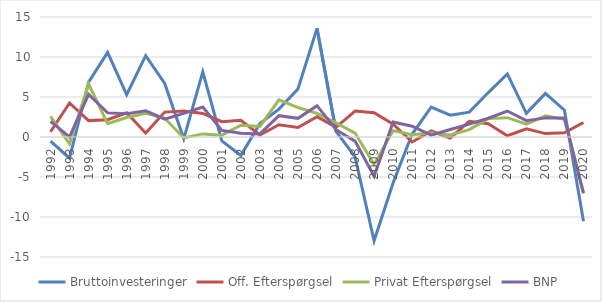
| Category | Bruttoinvesteringer | Off. Efterspørgsel | Privat Efterspørgsel | BNP |
|---|---|---|---|---|
| 1992 | -0.513 | 0.655 | 2.565 | 1.957 |
| 1993 | -2.643 | 4.259 | -0.861 | 0.011 |
| 1994 | 6.86 | 2.05 | 6.658 | 5.332 |
| 1995 | 10.566 | 2.155 | 1.679 | 3.028 |
| 1996 | 5.291 | 3.029 | 2.43 | 2.898 |
| 1997 | 10.165 | 0.508 | 2.962 | 3.267 |
| 1998 | 6.685 | 3.111 | 2.345 | 2.22 |
| 1999 | -0.228 | 3.249 | -0.12 | 2.948 |
| 2000 | 8.145 | 2.947 | 0.387 | 3.742 |
| 2001 | -0.484 | 1.917 | 0.226 | 0.823 |
| 2002 | -2.31 | 2.095 | 1.472 | 0.467 |
| 2003 | 1.68 | 0.256 | 1.32 | 0.388 |
| 2004 | 3.488 | 1.535 | 4.642 | 2.668 |
| 2005 | 6.002 | 1.191 | 3.685 | 2.336 |
| 2006 | 13.584 | 2.535 | 2.959 | 3.918 |
| 2007 | 0.712 | 1.214 | 1.766 | 0.913 |
| 2008 | -2.487 | 3.25 | 0.488 | -0.516 |
| 2009 | -12.978 | 3.042 | -3.443 | -4.905 |
| 2010 | -5.718 | 1.599 | 0.795 | 1.868 |
| 2011 | 0.366 | -0.626 | 0.278 | 1.342 |
| 2012 | 3.735 | 0.751 | 0.509 | 0.223 |
| 2013 | 2.722 | -0.121 | 0.265 | 0.935 |
| 2014 | 3.106 | 1.957 | 0.918 | 1.611 |
| 2015 | 5.556 | 1.662 | 2.297 | 2.348 |
| 2016 | 7.882 | 0.156 | 2.412 | 3.248 |
| 2017 | 2.961 | 1.011 | 1.617 | 2.037 |
| 2018 | 5.446 | 0.423 | 2.639 | 2.389 |
| 2019 | 3.353 | 0.537 | 2.206 | 2.367 |
| 2020 | -10.546 | 1.817 | -6.956 | -7.059 |